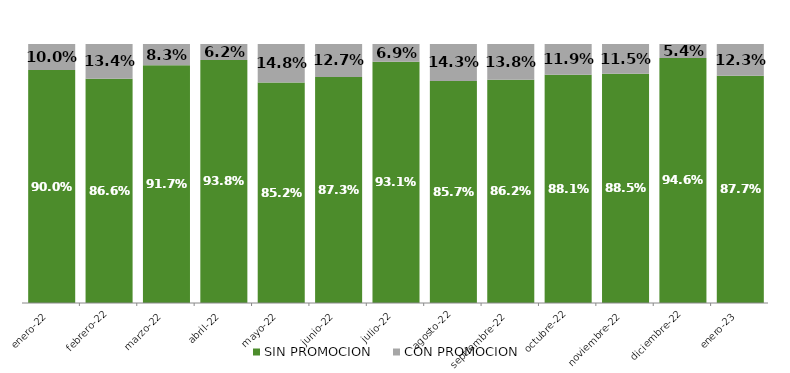
| Category | SIN PROMOCION   | CON PROMOCION   |
|---|---|---|
| 2022-01-01 | 0.9 | 0.1 |
| 2022-02-01 | 0.866 | 0.134 |
| 2022-03-01 | 0.917 | 0.083 |
| 2022-04-01 | 0.938 | 0.062 |
| 2022-05-01 | 0.852 | 0.148 |
| 2022-06-01 | 0.873 | 0.127 |
| 2022-07-01 | 0.931 | 0.069 |
| 2022-08-01 | 0.857 | 0.143 |
| 2022-09-01 | 0.862 | 0.138 |
| 2022-10-01 | 0.881 | 0.119 |
| 2022-11-01 | 0.885 | 0.115 |
| 2022-12-01 | 0.946 | 0.054 |
| 2023-01-01 | 0.877 | 0.123 |